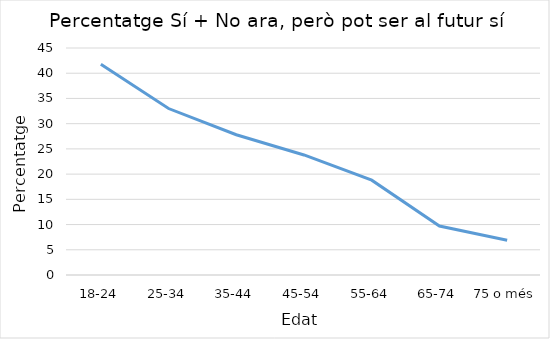
| Category | Series 0 |
|---|---|
| 18-24 | 41.8 |
| 25-34 | 33 |
| 35-44 | 27.8 |
| 45-54 | 23.8 |
| 55-64 | 18.8 |
| 65-74 | 9.7 |
| 75 o més | 6.9 |